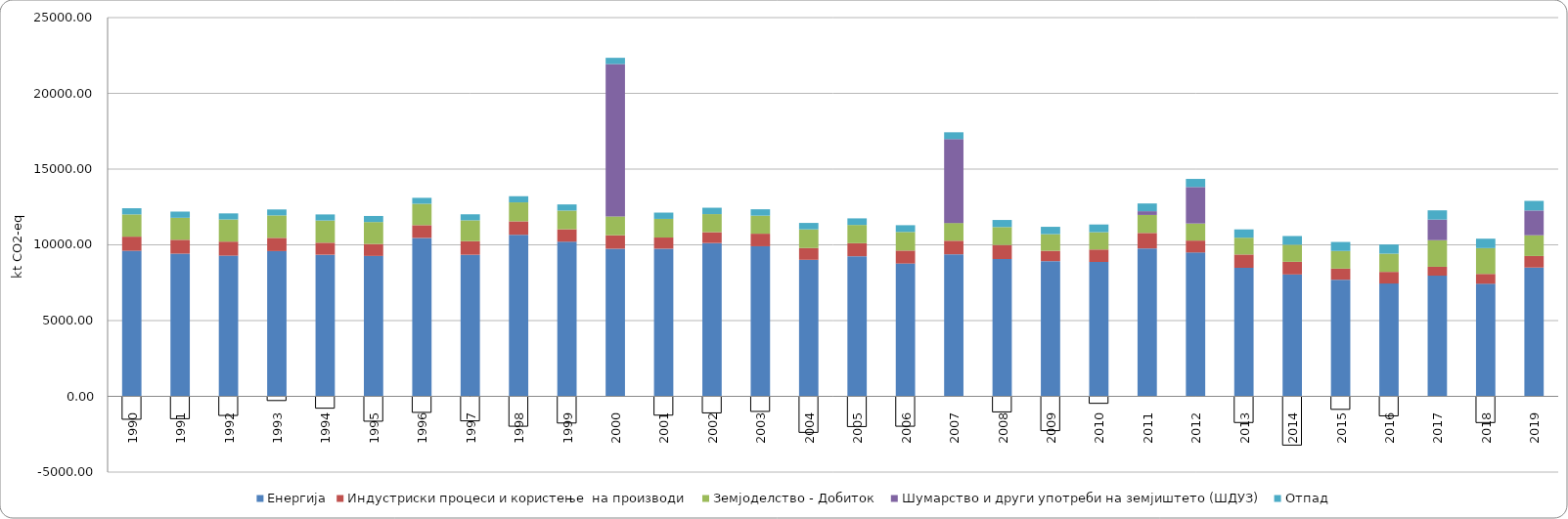
| Category | Енергија | Индустриски процеси и користење  на производи | Земјоделство - Добиток  | Шумарство и други употреби на земјиштето (ШДУЗ) | Отпад |
|---|---|---|---|---|---|
| 1990.0 | 9607.971 | 932.243 | 1468.166 | -1545.458 | 406.678 |
| 1991.0 | 9418.134 | 916.396 | 1450.661 | -1509.972 | 409.721 |
| 1992.0 | 9286.274 | 926.518 | 1463.303 | -1294.752 | 399.529 |
| 1993.0 | 9588.739 | 870.978 | 1483.542 | -308.612 | 391.919 |
| 1994.0 | 9346.518 | 794.23 | 1466.06 | -813.763 | 400.155 |
| 1995.0 | 9267.689 | 788.331 | 1448.612 | -1674.299 | 400.716 |
| 1996.0 | 10456.861 | 841.6 | 1412.797 | -1092.105 | 392.47 |
| 1997.0 | 9344.621 | 898.412 | 1376.09 | -1651.565 | 397.167 |
| 1998.0 | 10663.424 | 888.705 | 1250.817 | -2005.641 | 406.892 |
| 1999.0 | 10207.749 | 821.402 | 1231.691 | -1793.648 | 407.641 |
| 2000.0 | 9744.422 | 888.416 | 1244.276 | 10056.096 | 412.666 |
| 2001.0 | 9746.674 | 735.414 | 1230.947 | -1274.003 | 415.095 |
| 2002.0 | 10119.425 | 717.342 | 1191.223 | -1125.552 | 421.623 |
| 2003.0 | 9906.245 | 828.944 | 1192.22 | -1026.602 | 420.36 |
| 2004.0 | 9013.504 | 775.146 | 1233.961 | -2409.485 | 424.077 |
| 2005.0 | 9247.286 | 861.664 | 1203.125 | -2027.896 | 435.208 |
| 2006.0 | 8767.152 | 855.129 | 1227.973 | -2005.302 | 445.848 |
| 2007.0 | 9376.596 | 895.052 | 1171.682 | 5534.703 | 452.263 |
| 2008.0 | 9064.14 | 927.481 | 1181.692 | -1059.862 | 468.367 |
| 2009.0 | 8925.753 | 680.966 | 1098.682 | -2296.262 | 485.12 |
| 2010.0 | 8870.402 | 821.103 | 1142.965 | -493.463 | 508.84 |
| 2011.0 | 9763.894 | 1021.718 | 1186.551 | 246.216 | 513.247 |
| 2012.0 | 9495.478 | 785.868 | 1127.461 | 2409.273 | 534.963 |
| 2013.0 | 8484.226 | 877.627 | 1108.568 | -1760.061 | 548.625 |
| 2014.0 | 8045.076 | 835.886 | 1126.874 | -3251.96 | 573.779 |
| 2015.0 | 7696.971 | 734.158 | 1163.914 | -890.213 | 594.582 |
| 2016.0 | 7446.493 | 768.275 | 1202.646 | -1320.599 | 606.654 |
| 2017.0 | 7964.1 | 587.745 | 1755.126 | 1359.69 | 611.044 |
| 2018.0 | 7429.528 | 651.211 | 1704.387 | -1762.904 | 621.477 |
| 2019.0 | 8501.098 | 763.003 | 1368.297 | 1634.359 | 635.183 |